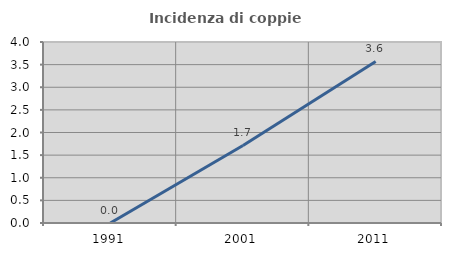
| Category | Incidenza di coppie miste |
|---|---|
| 1991.0 | 0 |
| 2001.0 | 1.714 |
| 2011.0 | 3.571 |